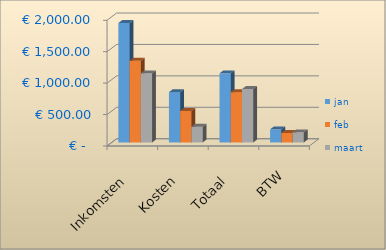
| Category | jan | feb | maart |
|---|---|---|---|
| Inkomsten | 1900 | 1300 | 1100 |
| Kosten | 800 | 500 | 250 |
| Totaal | 1100 | 800 | 850 |
| BTW | 209 | 152 | 161.5 |